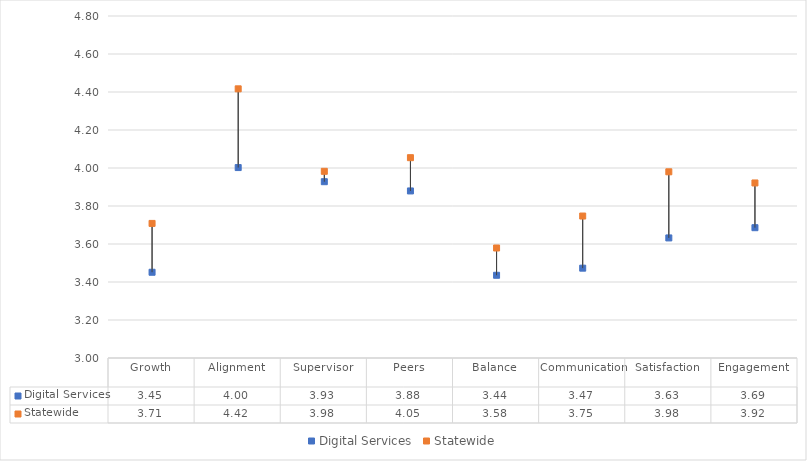
| Category | Digital Services | Statewide |
|---|---|---|
| Growth | 3.451 | 3.708 |
| Alignment | 4.002 | 4.417 |
| Supervisor | 3.928 | 3.983 |
| Peers | 3.879 | 4.054 |
| Balance | 3.435 | 3.579 |
| Communication | 3.473 | 3.747 |
| Satisfaction | 3.632 | 3.98 |
| Engagement | 3.686 | 3.921 |